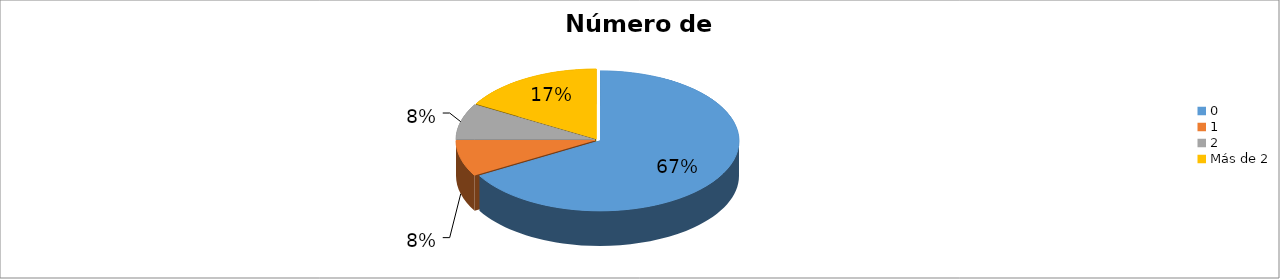
| Category | Series 0 |
|---|---|
| 0 | 0.667 |
| 1 | 0.083 |
| 2 | 0.083 |
| Más de 2 | 0.167 |